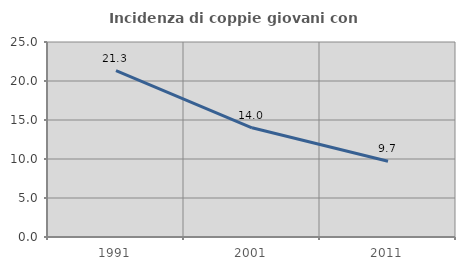
| Category | Incidenza di coppie giovani con figli |
|---|---|
| 1991.0 | 21.344 |
| 2001.0 | 13.997 |
| 2011.0 | 9.707 |